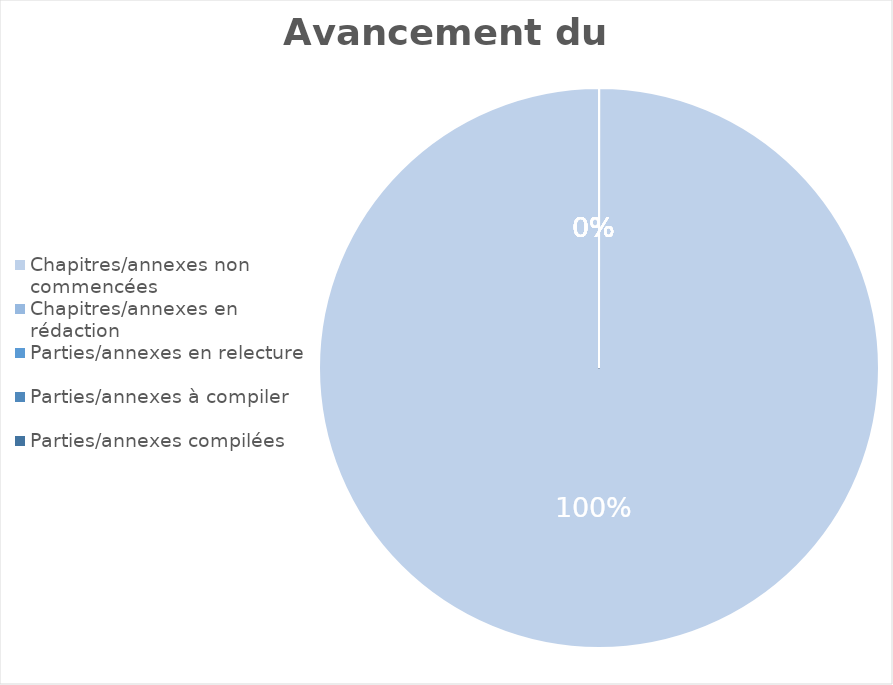
| Category | Series 0 |
|---|---|
| Chapitres/annexes non commencées | 1 |
| Chapitres/annexes en rédaction | 0 |
| Parties/annexes en relecture | 0 |
| Parties/annexes à compiler | 0 |
| Parties/annexes compilées | 0 |